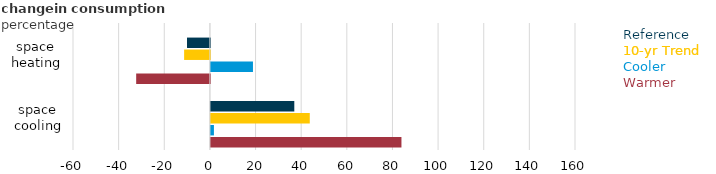
| Category | Warmer | Cooler | 10-yr Trend | Reference | Series 4 |
|---|---|---|---|---|---|
| space cooling | 83.504 | 1.321 | 43.328 | 36.547 |  |
| space heating | -32.312 | 18.431 | -11.3 | -10.031 |  |